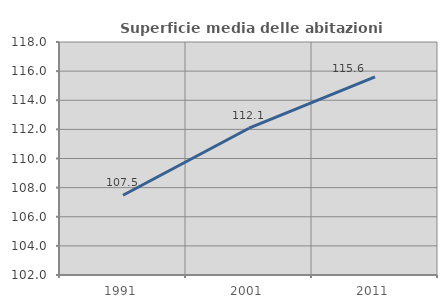
| Category | Superficie media delle abitazioni occupate |
|---|---|
| 1991.0 | 107.476 |
| 2001.0 | 112.08 |
| 2011.0 | 115.601 |